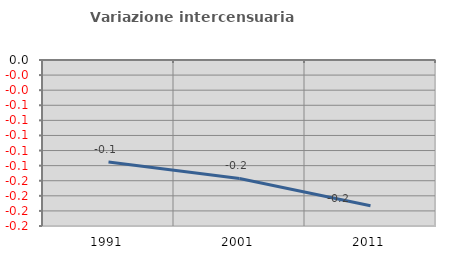
| Category | Variazione intercensuaria annua |
|---|---|
| 1991.0 | -0.135 |
| 2001.0 | -0.157 |
| 2011.0 | -0.193 |